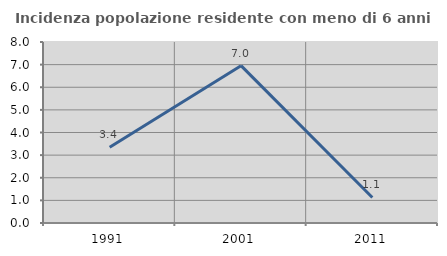
| Category | Incidenza popolazione residente con meno di 6 anni |
|---|---|
| 1991.0 | 3.351 |
| 2001.0 | 6.954 |
| 2011.0 | 1.128 |